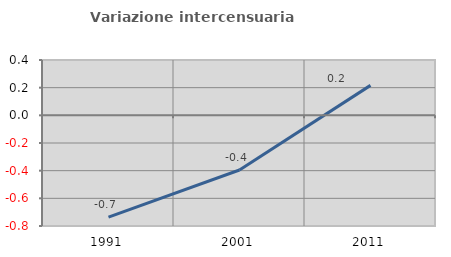
| Category | Variazione intercensuaria annua |
|---|---|
| 1991.0 | -0.736 |
| 2001.0 | -0.395 |
| 2011.0 | 0.217 |